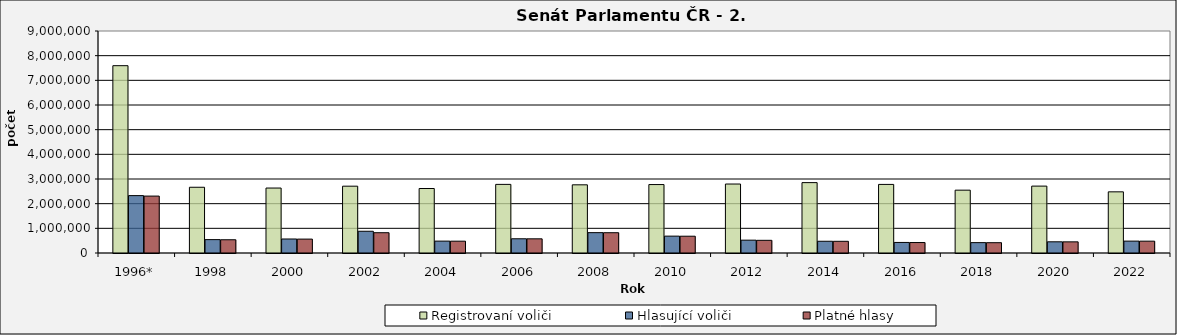
| Category | Registrovaní voliči | Hlasující voliči | Platné hlasy |
|---|---|---|---|
| 1996* | 7594316 | 2326464 | 2307259 |
| 1998 | 2665043 | 542660 | 537091 |
| 2000 | 2633794 | 567872 | 563524 |
| 2002 | 2708764 | 881693 | 822287 |
| 2004 | 2614630 | 481475 | 478891 |
| 2006 | 2781827 | 576630 | 574555 |
| 2008 | 2764218 | 825126 | 822353 |
| 2010 | 2774982 | 683705 | 680437 |
| 2012 | 2796196 | 520216 | 514092 |
| 2014 | 2853618 | 476334 | 473926 |
| 2016 | 2780597 | 427774 | 424089 |
| 2018 | 2547488 | 420118 | 417772 |
| 2020 | 2711956 | 453855 | 451863 |
| 2022 | 2479869 | 481993 | 479783 |